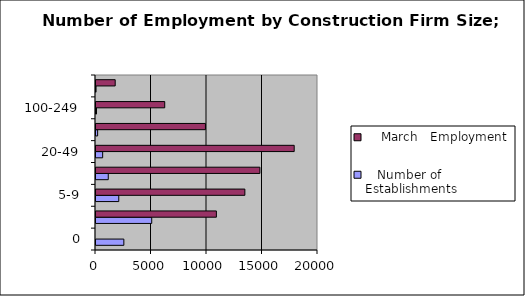
| Category |    Number of Establishments |     March   Employment |
|---|---|---|
| 0 | 2509 | 0 |
| 1-4 | 5021 | 10846 |
| 5-9 | 2051 | 13412 |
| 10-19 | 1105 | 14764 |
| 20-49 | 600 | 17856 |
| 50-99 | 147 | 9860 |
| 100-249 | 46 | 6192 |
| 250 & Over | 5 | 1730 |